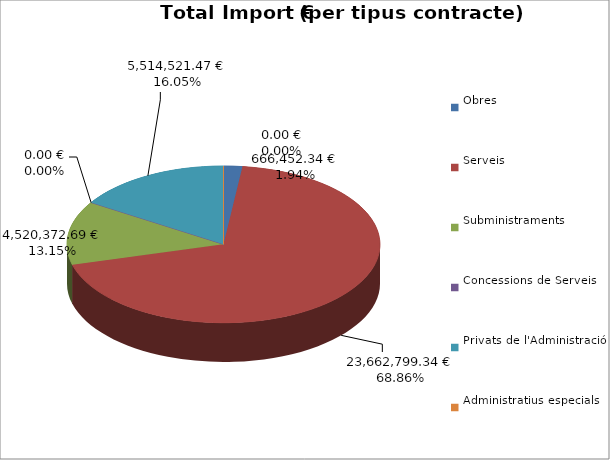
| Category | Total preu
(amb IVA) |
|---|---|
| Obres | 666452.34 |
| Serveis | 23662799.34 |
| Subministraments | 4520372.69 |
| Concessions de Serveis | 0 |
| Privats de l'Administració | 5514521.47 |
| Administratius especials | 0 |